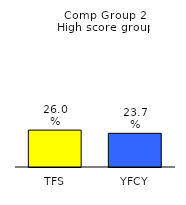
| Category | Series 0 |
|---|---|
| TFS | 0.26 |
| YFCY | 0.237 |